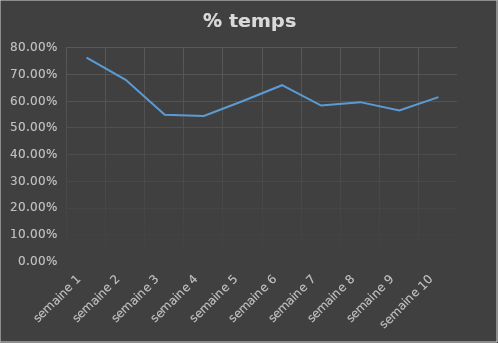
| Category | Ratio temps |
|---|---|
| semaine 1 | 0.76 |
| semaine 2 | 0.677 |
| semaine 3 | 0.547 |
| semaine 4 | 0.542 |
| semaine 5 | 0.598 |
| semaine 6 | 0.657 |
| semaine 7 | 0.581 |
| semaine 8 | 0.594 |
| semaine 9 | 0.563 |
| semaine 10 | 0.613 |